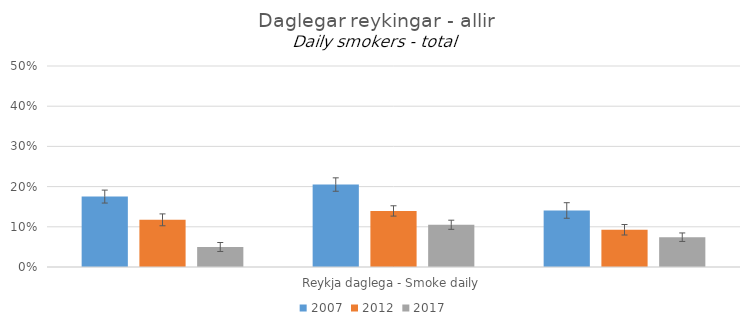
| Category | 2007 | 2012 | 2017 |
|---|---|---|---|
| 0 | 0.175 | 0.117 | 0.05 |
| 1 | 0.205 | 0.139 | 0.105 |
| 2 | 0.141 | 0.093 | 0.074 |